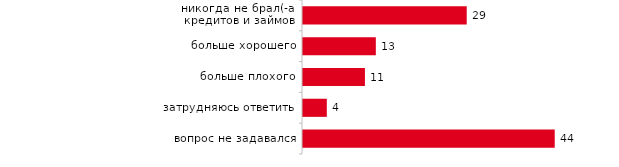
| Category | Series 0 |
|---|---|
| никогда не брал(-а) кредитов и займов | 28.521 |
| больше хорошего | 12.687 |
| больше плохого | 10.789 |
| затрудняюсь ответить | 4.146 |
| вопрос не задавался | 43.856 |